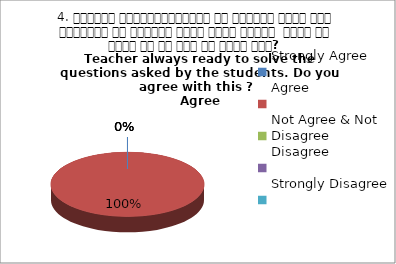
| Category | 4. शिक्षक विद्यार्थियों के द्वारा पूछे गये प्रश्नो का समाधान करने हेतु तत्पर  रहते है क्या आप इस बात से सहमत हैं? 
 Teacher always ready to solve the questions asked by the students. Do you agree with this ? 
 Agree |
|---|---|
| Strongly Agree | 0 |
| Agree | 1 |
| Not Agree & Not Disagree | 0 |
| Disagree | 0 |
| Strongly Disagree | 0 |